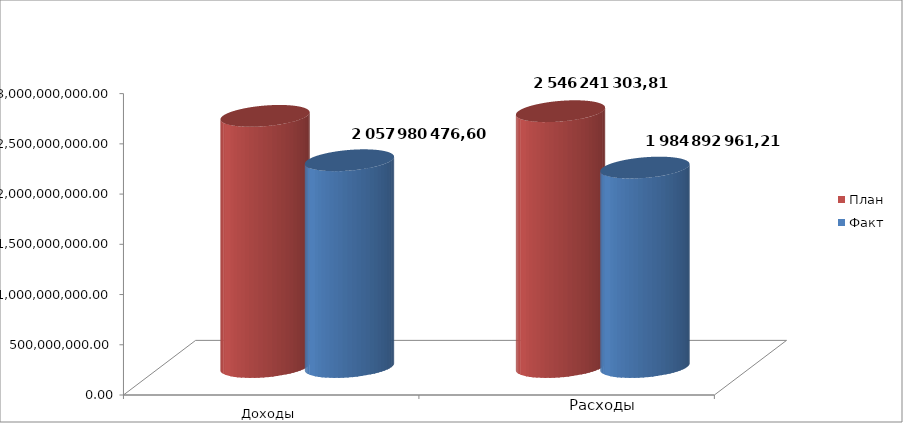
| Category | План | Факт |
|---|---|---|
| 0 | 2499749885.86 | 2057980476.6 |
| 1 | 2546241303.81 | 1984892961.21 |